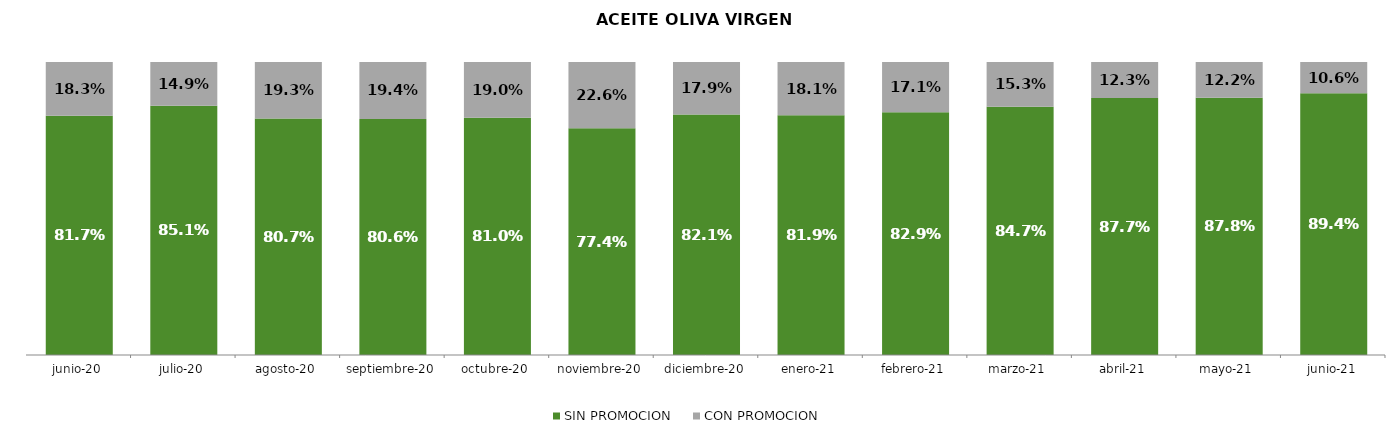
| Category | SIN PROMOCION   | CON PROMOCION   |
|---|---|---|
| 2020-06-01 | 0.817 | 0.183 |
| 2020-07-01 | 0.851 | 0.149 |
| 2020-08-01 | 0.807 | 0.193 |
| 2020-09-01 | 0.806 | 0.194 |
| 2020-10-01 | 0.81 | 0.19 |
| 2020-11-01 | 0.774 | 0.226 |
| 2020-12-01 | 0.821 | 0.179 |
| 2021-01-01 | 0.819 | 0.181 |
| 2021-02-01 | 0.829 | 0.171 |
| 2021-03-01 | 0.847 | 0.153 |
| 2021-04-01 | 0.877 | 0.123 |
| 2021-05-01 | 0.878 | 0.122 |
| 2021-06-01 | 0.894 | 0.106 |